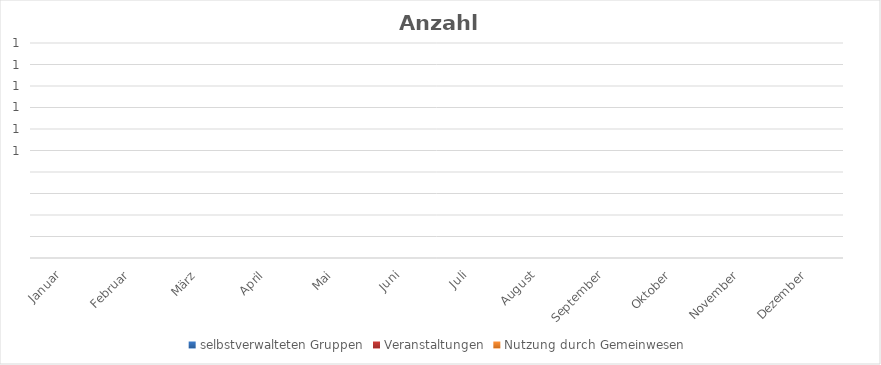
| Category | selbstverwalteten Gruppen | Veranstaltungen | Nutzung durch Gemeinwesen  |
|---|---|---|---|
| Januar | 0 | 0 | 0 |
| Februar | 0 | 0 | 0 |
| März | 0 | 0 | 0 |
| April | 0 | 0 | 0 |
| Mai | 0 | 0 | 0 |
| Juni | 0 | 0 | 0 |
| Juli | 0 | 0 | 0 |
| August | 0 | 0 | 0 |
| September | 0 | 0 | 0 |
| Oktober | 0 | 0 | 0 |
| November | 0 | 0 | 0 |
| Dezember | 0 | 0 | 0 |